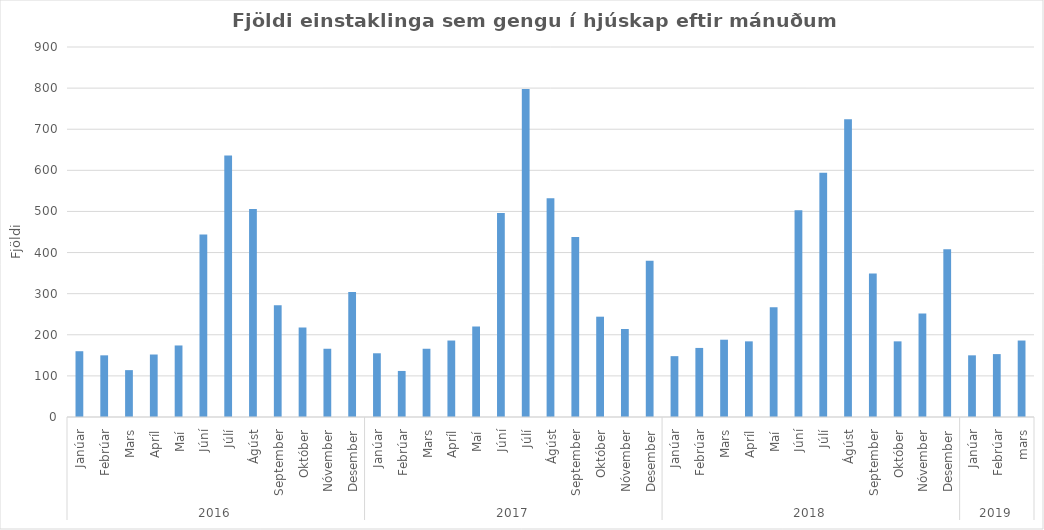
| Category | Series 0 |
|---|---|
| 0 | 160 |
| 1 | 150 |
| 2 | 114 |
| 3 | 152 |
| 4 | 174 |
| 5 | 444 |
| 6 | 636 |
| 7 | 506 |
| 8 | 272 |
| 9 | 218 |
| 10 | 166 |
| 11 | 304 |
| 12 | 155 |
| 13 | 112 |
| 14 | 166 |
| 15 | 186 |
| 16 | 220 |
| 17 | 496 |
| 18 | 798 |
| 19 | 532 |
| 20 | 438 |
| 21 | 244 |
| 22 | 214 |
| 23 | 380 |
| 24 | 148 |
| 25 | 168 |
| 26 | 188 |
| 27 | 184 |
| 28 | 267 |
| 29 | 503 |
| 30 | 594 |
| 31 | 724 |
| 32 | 349 |
| 33 | 184 |
| 34 | 252 |
| 35 | 408 |
| 36 | 150 |
| 37 | 153 |
| 38 | 186 |